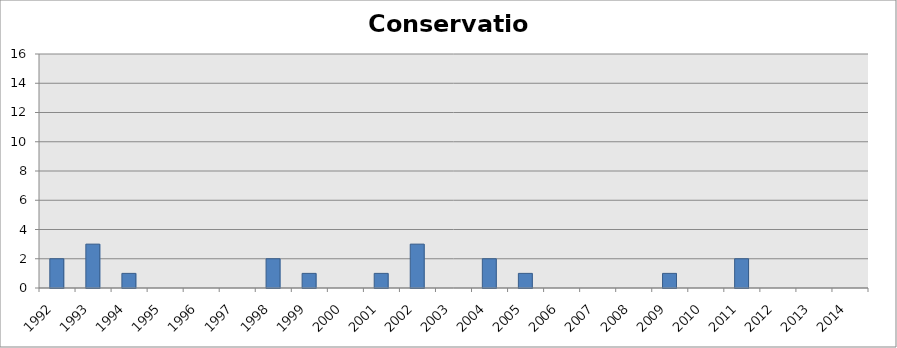
| Category | Conservation |
|---|---|
| 1992 | 2 |
| 1993 | 3 |
| 1994 | 1 |
| 1995 | 0 |
| 1996 | 0 |
| 1997 | 0 |
| 1998 | 2 |
| 1999 | 1 |
| 2000 | 0 |
| 2001 | 1 |
| 2002 | 3 |
| 2003 | 0 |
| 2004 | 2 |
| 2005 | 1 |
| 2006 | 0 |
| 2007 | 0 |
| 2008 | 0 |
| 2009 | 1 |
| 2010 | 0 |
| 2011 | 2 |
| 2012 | 0 |
| 2013 | 0 |
| 2014 | 0 |